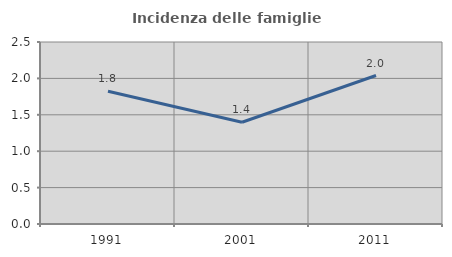
| Category | Incidenza delle famiglie numerose |
|---|---|
| 1991.0 | 1.825 |
| 2001.0 | 1.398 |
| 2011.0 | 2.04 |